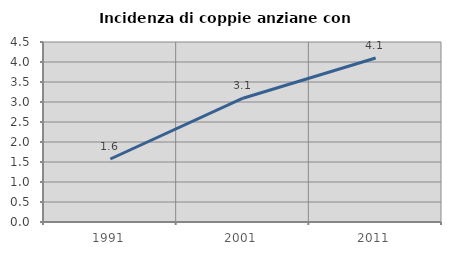
| Category | Incidenza di coppie anziane con figli |
|---|---|
| 1991.0 | 1.575 |
| 2001.0 | 3.095 |
| 2011.0 | 4.101 |